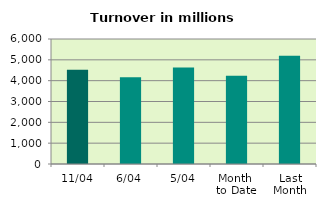
| Category | Series 0 |
|---|---|
| 11/04 | 4523.005 |
| 6/04 | 4160.436 |
| 5/04 | 4637.02 |
| Month 
to Date | 4230.467 |
| Last
Month | 5192.573 |